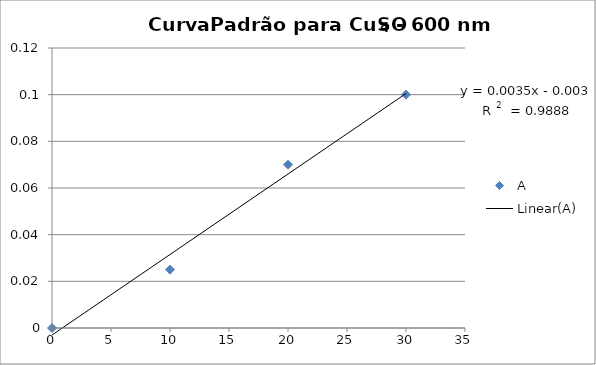
| Category | A |
|---|---|
| 0.0 | 0 |
| 10.0 | 0.025 |
| 20.0 | 0.07 |
| 30.0 | 0.1 |